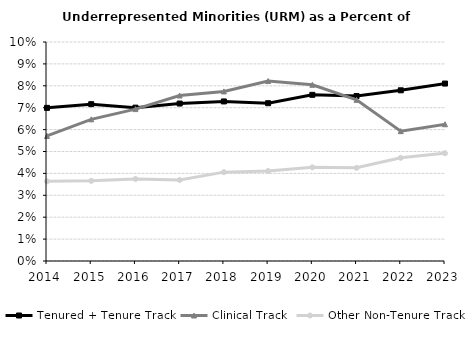
| Category | Tenured + Tenure Track | Clinical Track | Other Non-Tenure Track |
|---|---|---|---|
| 2014.0 | 0.07 | 0.057 | 0.036 |
| 2015.0 | 0.072 | 0.065 | 0.037 |
| 2016.0 | 0.07 | 0.069 | 0.037 |
| 2017.0 | 0.072 | 0.076 | 0.037 |
| 2018.0 | 0.073 | 0.077 | 0.041 |
| 2019.0 | 0.072 | 0.082 | 0.041 |
| 2020.0 | 0.076 | 0.08 | 0.043 |
| 2021.0 | 0.075 | 0.074 | 0.043 |
| 2022.0 | 0.078 | 0.059 | 0.047 |
| 2023.0 | 0.081 | 0.062 | 0.049 |